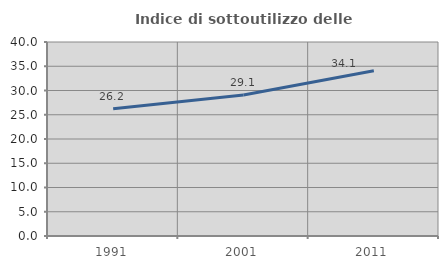
| Category | Indice di sottoutilizzo delle abitazioni  |
|---|---|
| 1991.0 | 26.237 |
| 2001.0 | 29.077 |
| 2011.0 | 34.087 |